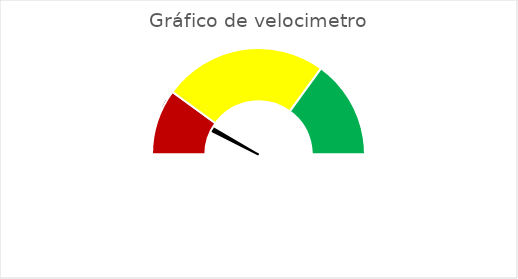
| Category | Series 0 |
|---|---|
| 0 | 0.15 |
| 1 | 0.02 |
| 2 | 1.85 |